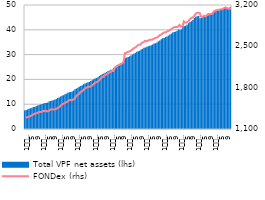
| Category | Total VPF net assets (lhs) |
|---|---|
| 1
2010 | 7.432 |
| 2 | 7.676 |
| 3 | 7.899 |
| 4 | 8.15 |
| 5 | 8.327 |
| 6 | 8.568 |
| 7 | 8.841 |
| 8 | 8.995 |
| 9 | 9.206 |
| 10 | 9.488 |
| 11 | 9.639 |
| 12 | 9.863 |
| 1
2011 | 10.082 |
| 2 | 10.238 |
| 3 | 10.435 |
| 4 | 10.51 |
| 5 | 10.725 |
| 6 | 11.067 |
| 7 | 11.306 |
| 8 | 11.45 |
| 9 | 11.587 |
| 10 | 11.853 |
| 11 | 12.123 |
| 12 | 12.452 |
| 1
2012 | 12.722 |
| 2 | 13.086 |
| 3 | 13.424 |
| 4 | 13.664 |
| 5 | 13.998 |
| 6 | 14.251 |
| 7 | 14.626 |
| 8 | 14.843 |
| 9 | 14.949 |
| 10 | 15.164 |
| 11 | 15.488 |
| 12 | 16.011 |
| 1
2013 | 16.312 |
| 2 | 16.606 |
| 3 | 17.045 |
| 4 | 17.324 |
| 5 | 17.63 |
| 6 | 18.041 |
| 7 | 18.363 |
| 8 | 18.611 |
| 9 | 18.841 |
| 10 | 18.989 |
| 11 | 19.318 |
| 12 | 19.701 |
| 1
2014 | 20.09 |
| 2 | 20.353 |
| 3 | 20.591 |
| 4 | 20.907 |
| 5 | 21.365 |
| 6 | 21.731 |
| 7 | 22.07 |
| 8 | 22.377 |
| 9 | 22.695 |
| 10 | 22.976 |
| 11 | 23.345 |
| 12 | 23.565 |
| 1
2015 | 23.891 |
| 2 | 23.98 |
| 3 | 24.649 |
| 4 | 25.107 |
| 5 | 25.375 |
| 6 | 25.527 |
| 7 | 25.849 |
| 8 | 26.048 |
| 9 | 26.4 |
| 10 | 28.345 |
| 11 | 28.533 |
| 12 | 28.875 |
| 1
2016 | 29.063 |
| 2 | 29.32 |
| 3 | 29.641 |
| 4 | 30.062 |
| 5 | 30.363 |
| 6 | 30.713 |
| 7 | 31.161 |
| 8 | 31.309 |
| 9 | 31.585 |
| 10 | 32.066 |
| 11 | 32.326 |
| 12 | 32.79 |
| 1
2017 | 32.869 |
| 2 | 33.119 |
| 3 | 33.378 |
| 4 | 33.567 |
| 5 | 33.733 |
| 6 | 34.082 |
| 7 | 34.431 |
| 8 | 34.568 |
| 9 | 34.884 |
| 10 | 35.366 |
| 11 | 35.717 |
| 12 | 36.152 |
| 1
2018 | 36.58 |
| 2 | 36.731 |
| 3 | 37.098 |
| 4 | 37.331 |
| 5 | 37.654 |
| 6 | 38.068 |
| 7 | 38.458 |
| 8 | 38.868 |
| 9 | 39.096 |
| 10 | 39.259 |
| 11 | 39.594 |
| 12 | 40.185 |
| 1
2019 | 39.918 |
| 2 | 40.205 |
| 3 | 41.641 |
| 4 | 41.434 |
| 5 | 41.619 |
| 6 | 42.072 |
| 7 | 42.658 |
| 8 | 43.177 |
| 9 | 43.484 |
| 10 | 43.928 |
| 11 | 44.725 |
| 12 | 45.246 |
| 1
2020 | 45.504 |
| 2 | 45.63 |
| 3 | 44.646 |
| 4 | 44.766 |
| 5 | 45.186 |
| 6 | 45.144 |
| 7 | 45.438 |
| 8 | 45.855 |
| 9 | 45.862 |
| 10 | 46.06 |
| 11 | 46.289 |
| 12 | 47.018 |
| 1
2021 | 47.284 |
| 2 | 47.539 |
| 3 | 47.713 |
| 4 | 47.89 |
| 5 | 48.016 |
| 6 | 48.204 |
| 7 | 48.544 |
| 8 | 48.843 |
| 9 | 48.805 |
| 10 | 48.741 |
| 11 | 48.916 |
| 12 | 49.053 |